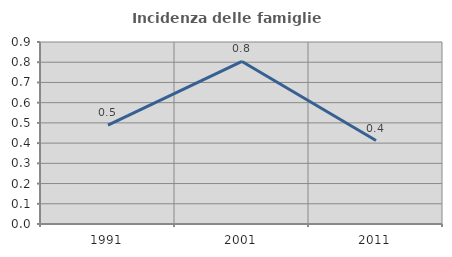
| Category | Incidenza delle famiglie numerose |
|---|---|
| 1991.0 | 0.489 |
| 2001.0 | 0.804 |
| 2011.0 | 0.413 |